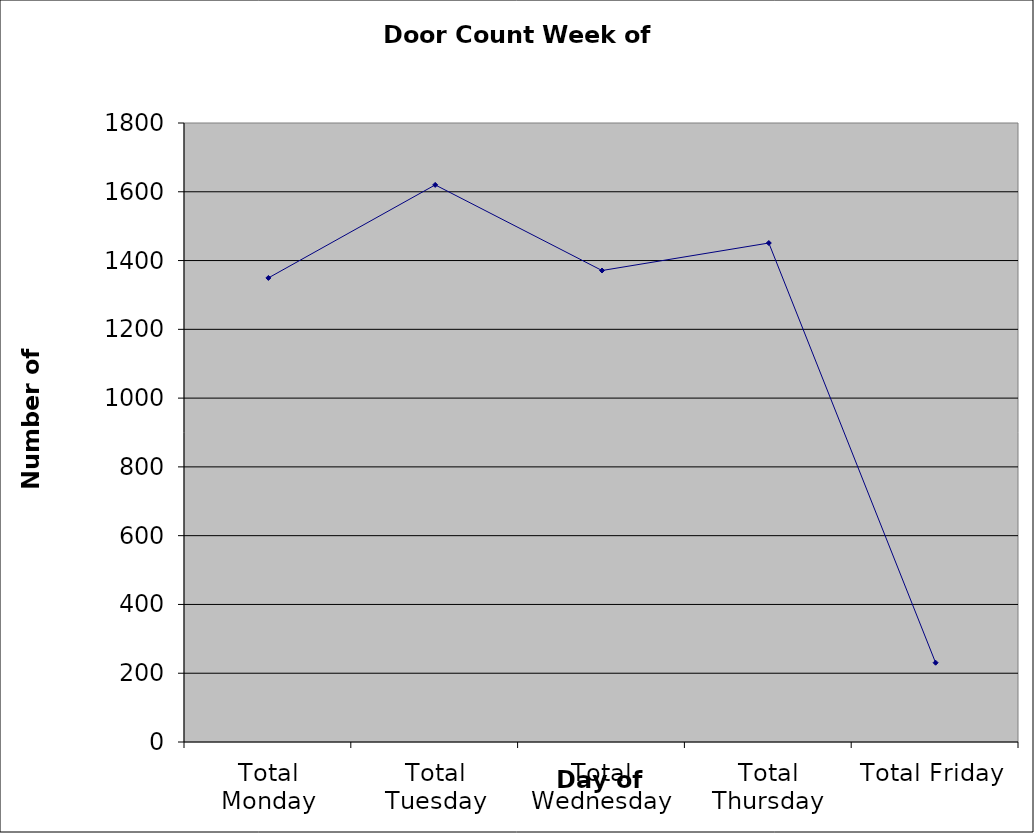
| Category | Series 0 |
|---|---|
| Total Monday | 1349.5 |
| Total Tuesday | 1620 |
| Total Wednesday | 1371 |
| Total Thursday | 1451 |
| Total Friday | 230.5 |